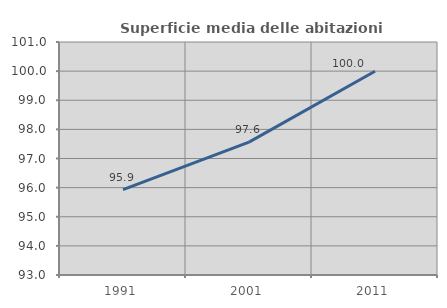
| Category | Superficie media delle abitazioni occupate |
|---|---|
| 1991.0 | 95.93 |
| 2001.0 | 97.563 |
| 2011.0 | 99.997 |